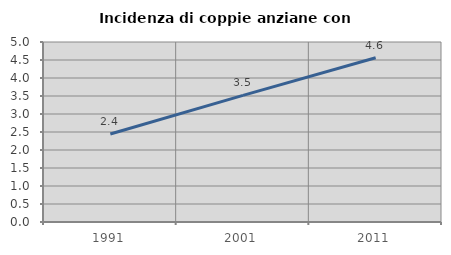
| Category | Incidenza di coppie anziane con figli |
|---|---|
| 1991.0 | 2.446 |
| 2001.0 | 3.516 |
| 2011.0 | 4.561 |